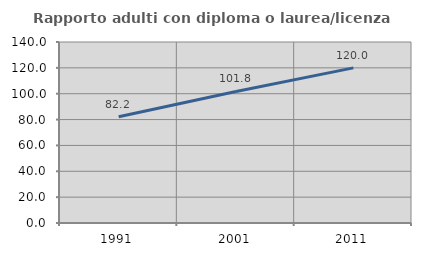
| Category | Rapporto adulti con diploma o laurea/licenza media  |
|---|---|
| 1991.0 | 82.222 |
| 2001.0 | 101.754 |
| 2011.0 | 120 |